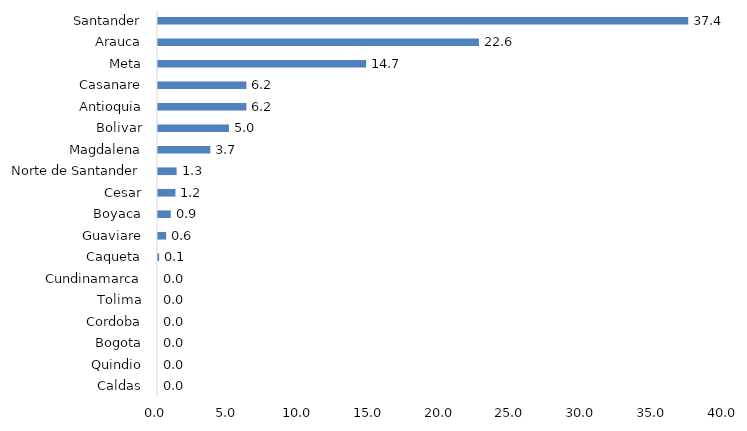
| Category | Series 0 |
|---|---|
| Caldas | 0 |
| Quindio | 0 |
| Bogota | 0 |
| Cordoba | 0 |
| Tolima | 0 |
| Cundinamarca | 0 |
| Caqueta | 0.082 |
| Guaviare | 0.574 |
| Boyaca | 0.902 |
| Cesar | 1.231 |
| Norte de Santander | 1.313 |
| Magdalena | 3.692 |
| Bolivar | 5.004 |
| Antioquia | 6.235 |
| Casanare | 6.235 |
| Meta | 14.684 |
| Arauca | 22.642 |
| Santander | 37.408 |